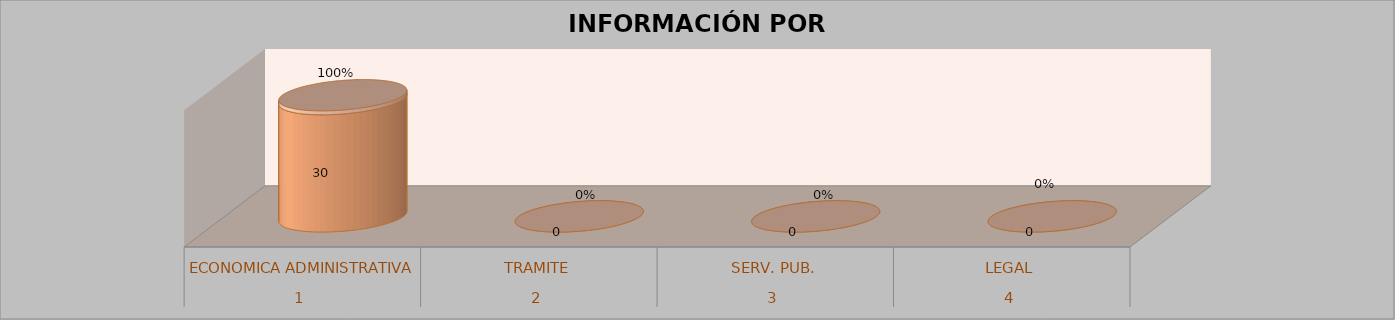
| Category | Series 0 | Series 1 | Series 2 | Series 3 |
|---|---|---|---|---|
| 0 |  |  | 30 | 1 |
| 1 |  |  | 0 | 0 |
| 2 |  |  | 0 | 0 |
| 3 |  |  | 0 | 0 |